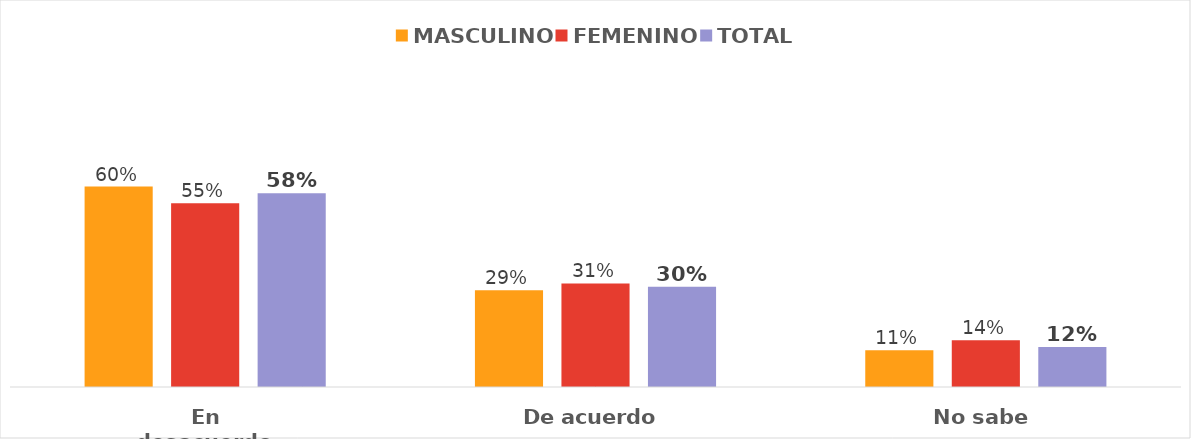
| Category | MASCULINO | FEMENINO | TOTAL |
|---|---|---|---|
| En desacuerdo | 0.6 | 0.55 | 0.58 |
| De acuerdo | 0.29 | 0.31 | 0.3 |
| No sabe | 0.11 | 0.14 | 0.12 |